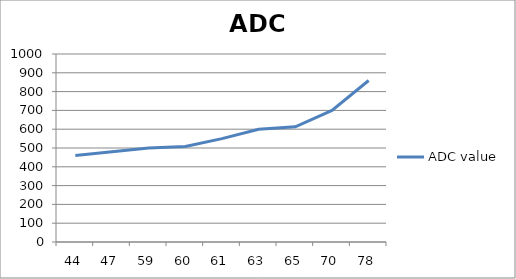
| Category | ADC value |
|---|---|
| 44.0 | 460 |
| 47.0 | 480 |
| 59.0 | 500 |
| 60.0 | 508 |
| 61.0 | 550 |
| 63.0 | 600 |
| 65.0 | 613 |
| 70.0 | 700 |
| 78.0 | 859 |